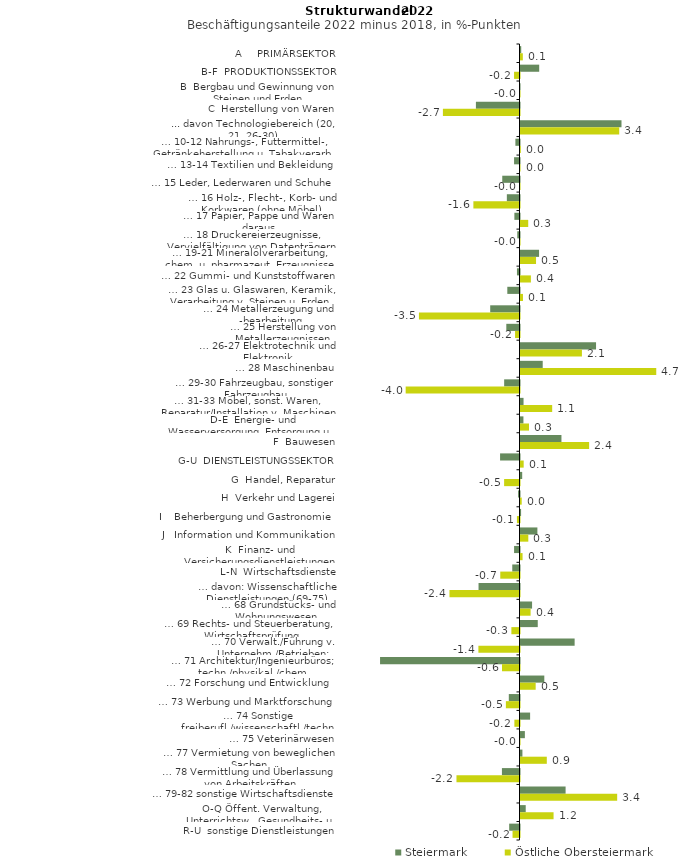
| Category | Steiermark | Östliche Obersteiermark |
|---|---|---|
| A     PRIMÄRSEKTOR | 0.025 | 0.081 |
| B-F  PRODUKTIONSSEKTOR | 0.65 | -0.19 |
| B  Bergbau und Gewinnung von Steinen und Erden | -0.011 | -0.018 |
| C  Herstellung von Waren | -1.516 | -2.664 |
| ... davon Technologiebereich (20, 21, 26-30) | 3.513 | 3.434 |
| … 10-12 Nahrungs-, Futtermittel-, Getränkeherstellung u. Tabakverarb. | -0.143 | 0.011 |
| … 13-14 Textilien und Bekleidung | -0.189 | 0 |
| … 15 Leder, Lederwaren und Schuhe | -0.6 | -0.005 |
| … 16 Holz-, Flecht-, Korb- und Korkwaren (ohne Möbel)  | -0.44 | -1.604 |
| … 17 Papier, Pappe und Waren daraus  | -0.178 | 0.269 |
| … 18 Druckereierzeugnisse, Vervielfältigung von Datenträgern | -0.077 | -0.007 |
| … 19-21 Mineralölverarbeitung, chem. u. pharmazeut. Erzeugnisse | 0.646 | 0.54 |
| … 22 Gummi- und Kunststoffwaren | -0.089 | 0.362 |
| … 23 Glas u. Glaswaren, Keramik, Verarbeitung v. Steinen u. Erden  | -0.424 | 0.086 |
| … 24 Metallerzeugung und -bearbeitung | -1.019 | -3.498 |
| … 25 Herstellung von Metallerzeugnissen  | -0.459 | -0.154 |
| … 26-27 Elektrotechnik und Elektronik | 2.628 | 2.136 |
| … 28 Maschinenbau | 0.773 | 4.722 |
| … 29-30 Fahrzeugbau, sonstiger Fahrzeugbau | -0.534 | -3.959 |
| … 31-33 Möbel, sonst. Waren, Reparatur/Installation v. Maschinen | 0.106 | 1.102 |
| D-E  Energie- und Wasserversorgung, Entsorgung u. Rückgewinnung | 0.102 | 0.296 |
| F  Bauwesen | 1.424 | 2.387 |
| G-U  DIENSTLEISTUNGSSEKTOR | -0.676 | 0.111 |
| G  Handel, Reparatur | 0.059 | -0.535 |
| H  Verkehr und Lagerei | -0.05 | 0.042 |
| I    Beherbergung und Gastronomie | 0.02 | -0.089 |
| J   Information und Kommunikation | 0.588 | 0.272 |
| K  Finanz- und Versicherungsdienstleistungen | -0.188 | 0.072 |
| L-N  Wirtschaftsdienste | -0.252 | -0.669 |
| … davon: Wissenschaftliche Dienstleistungen (69-75) | -1.425 | -2.436 |
| … 68 Grundstücks- und Wohnungswesen  | 0.402 | 0.351 |
| … 69 Rechts- und Steuerberatung, Wirtschaftsprüfung | 0.6 | -0.282 |
| … 70 Verwalt./Führung v. Unternehm./Betrieben; Unternehmensberat. | 1.883 | -1.43 |
| … 71 Architektur/Ingenieurbüros; techn./physikal./chem. Untersuchung | -4.85 | -0.608 |
| … 72 Forschung und Entwicklung  | 0.828 | 0.528 |
| … 73 Werbung und Marktforschung | -0.372 | -0.474 |
| … 74 Sonstige freiberufl./wissenschaftl./techn. Tätigkeiten | 0.334 | -0.178 |
| … 75 Veterinärwesen | 0.152 | -0.01 |
| … 77 Vermietung von beweglichen Sachen  | 0.067 | 0.915 |
| … 78 Vermittlung und Überlassung von Arbeitskräften | -0.611 | -2.192 |
| … 79-82 sonstige Wirtschaftsdienste | 1.569 | 3.362 |
| O-Q Öffent. Verwaltung, Unterrichtsw., Gesundheits- u. Sozialwesen | 0.182 | 1.15 |
| R-U  sonstige Dienstleistungen | -0.359 | -0.242 |